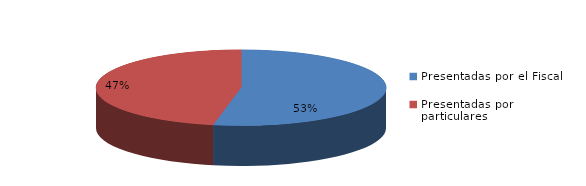
| Category | Series 0 |
|---|---|
| Presentadas por el Fiscal | 78 |
| Presentadas por particulares | 69 |